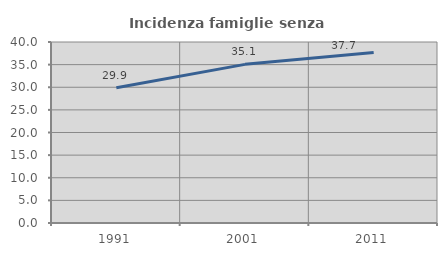
| Category | Incidenza famiglie senza nuclei |
|---|---|
| 1991.0 | 29.894 |
| 2001.0 | 35.059 |
| 2011.0 | 37.702 |